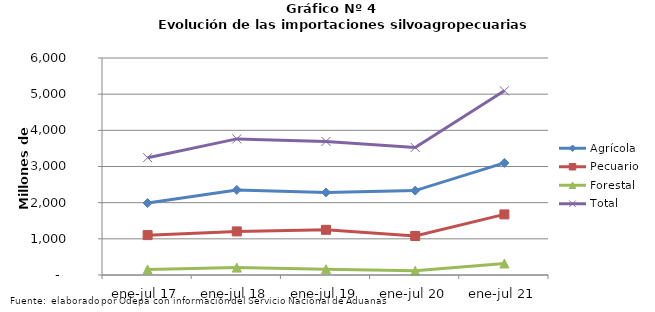
| Category | Agrícola | Pecuario | Forestal | Total |
|---|---|---|---|---|
| ene-jul 17 | 1988902 | 1102377 | 153020 | 3244299 |
| ene-jul 18 | 2353041 | 1205273 | 205081 | 3763395 |
| ene-jul 19 | 2283190 | 1249462 | 160128 | 3692780 |
| ene-jul 20 | 2333346 | 1078713 | 115402 | 3527461 |
| ene-jul 21 | 3098993 | 1675807 | 318277 | 5093077 |